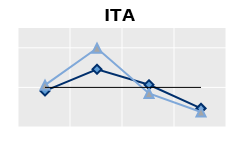
| Category | Foreign-born | Native-born | Series 1 |
|---|---|---|---|
| 15-24 | 0.911 | 1.057 | 1 |
| 25-54 | 1.457 | 1.987 | 1 |
| 55-64 | 1.065 | 0.848 | 1 |
| 65+ | 0.47 | 0.38 | 1 |